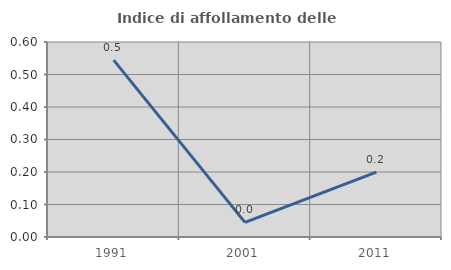
| Category | Indice di affollamento delle abitazioni  |
|---|---|
| 1991.0 | 0.544 |
| 2001.0 | 0.045 |
| 2011.0 | 0.2 |